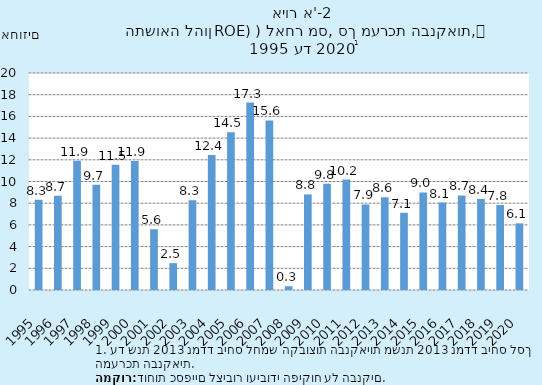
| Category | המרווח הפיננסי | ROE 99005 |
|---|---|---|
| 1995.0 |  | 8.328 |
| 1996.0 |  | 8.691 |
| 1997.0 |  | 11.91 |
| 1998.0 |  | 9.706 |
| 1999.0 |  | 11.538 |
| 2000.0 |  | 11.888 |
| 2001.0 |  | 5.6 |
| 2002.0 |  | 2.477 |
| 2003.0 |  | 8.272 |
| 2004.0 |  | 12.433 |
| 2005.0 |  | 14.531 |
| 2006.0 |  | 17.273 |
| 2007.0 |  | 15.632 |
| 2008.0 |  | 0.347 |
| 2009.0 |  | 8.805 |
| 2010.0 |  | 9.793 |
| 2011.0 |  | 10.175 |
| 2012.0 |  | 7.883 |
| 2013.0 |  | 8.55 |
| 2014.0 |  | 7.12 |
| 2015.0 |  | 8.99 |
| 2016.0 |  | 8.06 |
| 2017.0 |  | 8.71 |
| 2018.0 |  | 8.39 |
| 2019.0 |  | 7.84 |
| 2020.0 |  | 6.14 |